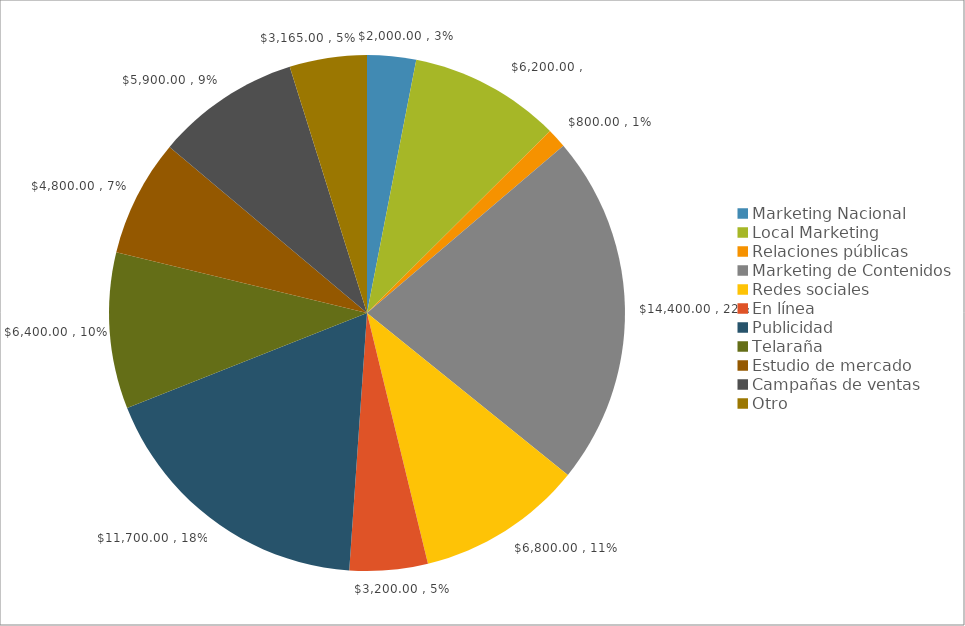
| Category | Series 0 | Series 1 |
|---|---|---|
| Marketing Nacional | 2000 | 0 |
| Local Marketing | 6200 | 0 |
| Relaciones públicas | 800 | 0 |
| Marketing de Contenidos | 14400 | 0 |
| Redes sociales | 6800 | 0 |
| En línea | 3200 | 0 |
| Publicidad | 11700 | 0 |
| Telaraña | 6400 | 0 |
| Estudio de mercado | 4800 | 0 |
| Campañas de ventas | 5900 | 0 |
| Otro | 3165 | 0 |